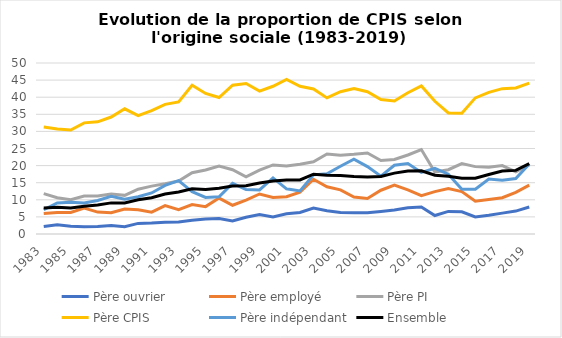
| Category | Père ouvrier | Père employé | Père PI | Père CPIS | Père indépendant | Ensemble |
|---|---|---|---|---|---|---|
| 1983.0 | 2.2 | 6 | 11.8 | 31.3 | 7.1 | 7.6 |
| 1984.0 | 2.7 | 6.3 | 10.6 | 30.7 | 9.1 | 7.8 |
| 1985.0 | 2.3 | 6.3 | 10 | 30.4 | 9.3 | 7.6 |
| 1986.0 | 2.1 | 7.6 | 11.1 | 32.5 | 9.1 | 8.1 |
| 1987.0 | 2.2 | 6.4 | 11.1 | 32.8 | 9.8 | 8.5 |
| 1988.0 | 2.5 | 6.2 | 11.7 | 34.2 | 11 | 9.1 |
| 1989.0 | 2.1 | 7.3 | 11.3 | 36.6 | 10.2 | 9.1 |
| 1990.0 | 3.1 | 7.1 | 13.1 | 34.6 | 10.9 | 10 |
| 1991.0 | 3.2 | 6.4 | 14 | 36.1 | 12 | 10.6 |
| 1992.0 | 3.4 | 8.3 | 14.7 | 37.9 | 14.2 | 11.7 |
| 1993.0 | 3.5 | 7.1 | 15.5 | 38.6 | 15.6 | 12.3 |
| 1994.0 | 4 | 8.6 | 17.9 | 43.5 | 12.4 | 13.2 |
| 1995.0 | 4.4 | 8 | 18.7 | 41.1 | 10.7 | 13 |
| 1996.0 | 4.5 | 10.5 | 19.9 | 39.9 | 10.9 | 13.4 |
| 1997.0 | 3.8 | 8.4 | 18.8 | 43.5 | 14.8 | 14 |
| 1998.0 | 4.9 | 9.9 | 16.7 | 44 | 13 | 14.1 |
| 1999.0 | 5.7 | 11.7 | 18.7 | 41.8 | 12.9 | 14.9 |
| 2000.0 | 5 | 10.7 | 20.2 | 43.2 | 16.4 | 15.5 |
| 2001.0 | 5.9 | 10.9 | 19.9 | 45.2 | 13.2 | 15.8 |
| 2002.0 | 6.3 | 12.2 | 20.4 | 43.2 | 12.6 | 15.8 |
| 2003.0 | 7.6 | 16 | 21.1 | 42.4 | 17.3 | 17.5 |
| 2004.0 | 6.8 | 13.8 | 23.4 | 39.8 | 17.6 | 17.2 |
| 2005.0 | 6.3 | 12.9 | 23 | 41.6 | 19.8 | 17.1 |
| 2006.0 | 6.2 | 10.8 | 23.3 | 42.5 | 21.9 | 16.8 |
| 2007.0 | 6.2 | 10.4 | 23.7 | 41.6 | 19.7 | 16.7 |
| 2008.0 | 6.6 | 12.8 | 21.5 | 39.3 | 16.9 | 16.8 |
| 2009.0 | 7 | 14.3 | 21.8 | 38.9 | 20.1 | 17.8 |
| 2010.0 | 7.7 | 12.9 | 23.1 | 41.3 | 20.6 | 18.4 |
| 2011.0 | 7.9 | 11.2 | 24.7 | 43.3 | 18 | 18.5 |
| 2012.0 | 5.4 | 12.4 | 18.1 | 38.8 | 19.2 | 17.2 |
| 2013.0 | 6.6 | 13.3 | 18.8 | 35.4 | 17.5 | 16.9 |
| 2014.0 | 6.5 | 12.4 | 20.6 | 35.3 | 13.1 | 16.3 |
| 2015.0 | 5 | 9.6 | 19.7 | 39.8 | 13.1 | 16.3 |
| 2016.0 | 5.5 | 10.1 | 19.5 | 41.4 | 16.1 | 17.4 |
| 2017.0 | 6.1 | 10.6 | 20 | 42.5 | 15.7 | 18.4 |
| 2018.0 | 6.7 | 12.2 | 18.2 | 42.7 | 16.2 | 18.6 |
| 2019.0 | 7.9 | 14.3 | 20.2 | 44.1 | 20.5 | 20.6 |